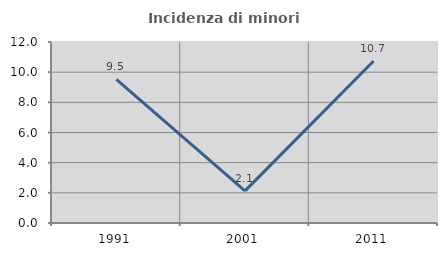
| Category | Incidenza di minori stranieri |
|---|---|
| 1991.0 | 9.524 |
| 2001.0 | 2.128 |
| 2011.0 | 10.744 |